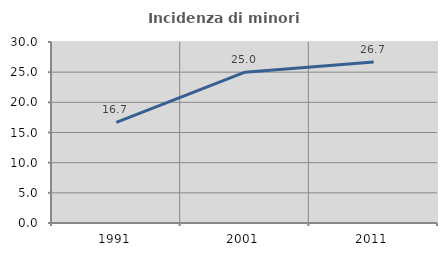
| Category | Incidenza di minori stranieri |
|---|---|
| 1991.0 | 16.667 |
| 2001.0 | 25 |
| 2011.0 | 26.667 |